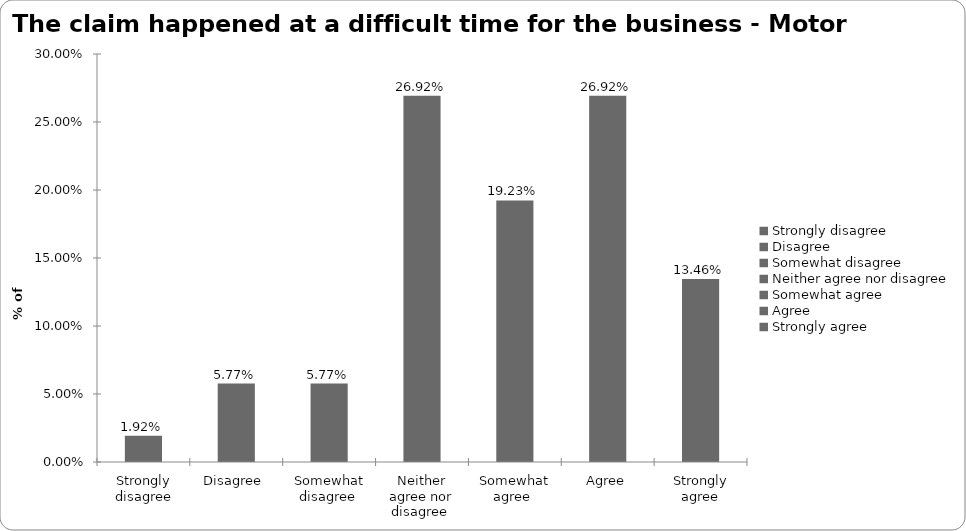
| Category | Motor |
|---|---|
| Strongly disagree | 0.019 |
| Disagree  | 0.058 |
| Somewhat disagree  | 0.058 |
| Neither agree nor disagree  | 0.269 |
| Somewhat agree  | 0.192 |
| Agree | 0.269 |
| Strongly agree | 0.135 |